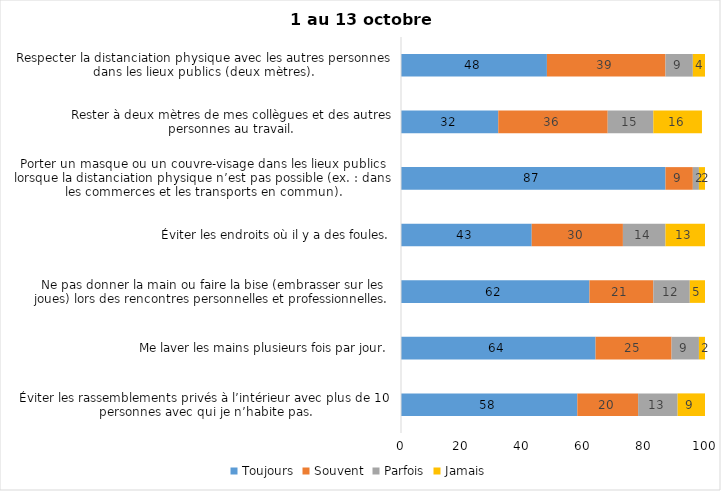
| Category | Toujours | Souvent | Parfois | Jamais |
|---|---|---|---|---|
| Éviter les rassemblements privés à l’intérieur avec plus de 10 personnes avec qui je n’habite pas. | 58 | 20 | 13 | 9 |
| Me laver les mains plusieurs fois par jour. | 64 | 25 | 9 | 2 |
| Ne pas donner la main ou faire la bise (embrasser sur les joues) lors des rencontres personnelles et professionnelles. | 62 | 21 | 12 | 5 |
| Éviter les endroits où il y a des foules. | 43 | 30 | 14 | 13 |
| Porter un masque ou un couvre-visage dans les lieux publics lorsque la distanciation physique n’est pas possible (ex. : dans les commerces et les transports en commun). | 87 | 9 | 2 | 2 |
| Rester à deux mètres de mes collègues et des autres personnes au travail. | 32 | 36 | 15 | 16 |
| Respecter la distanciation physique avec les autres personnes dans les lieux publics (deux mètres). | 48 | 39 | 9 | 4 |